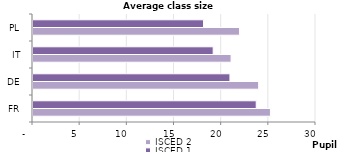
| Category | ISCED 2 | ISCED 1 |
|---|---|---|
| FR | 25.171 | 23.664 |
| DE | 23.921 | 20.878 |
| IT | 20.997 | 19.101 |
| PL | 21.889 | 18.08 |